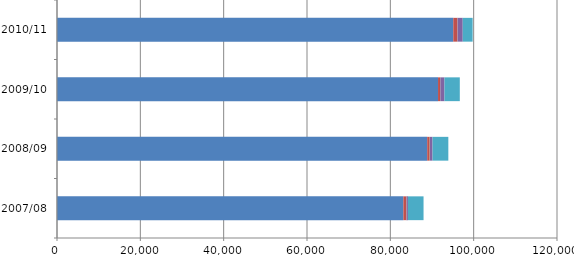
| Category | M0: Medical and dental staff, hospitals | M1: Medical and dental staff (locum only) | M2: Public health and community health services (medical) | M8: Doctors in training | M9: GPs and dental* |
|---|---|---|---|---|---|
| 2007/08 | 83123 | 709 | 44 | 350 | 3744 |
| 2008/09 | 88849 | 588 | 45 | 647 | 3791 |
| 2009/10 | 91449 | 514 | 30 | 998 | 3682 |
| 2010/11 | 95106 | 1001 | 25 | 1245 | 2377 |